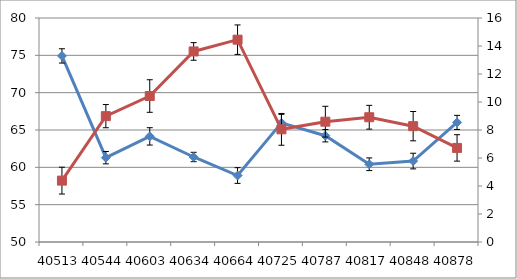
| Category | Series 0 |
|---|---|
| 40513.0 | 74.922 |
| 40544.0 | 61.293 |
| 40603.0 | 64.147 |
| 40634.0 | 61.384 |
| 40664.0 | 58.904 |
| 40725.0 | 65.958 |
| 40787.0 | 64.234 |
| 40817.0 | 60.413 |
| 40848.0 | 60.84 |
| 40878.0 | 66.016 |